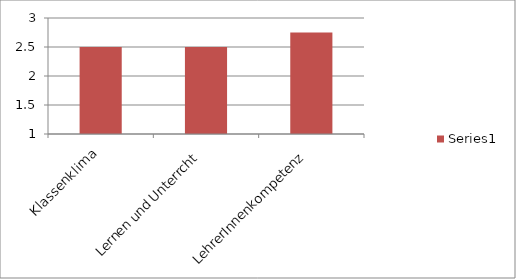
| Category | Series 1 |
|---|---|
| Klassenklima | 2.5 |
| Lernen und Unterrcht | 2.5 |
| LehrerInnenkompetenz | 2.75 |